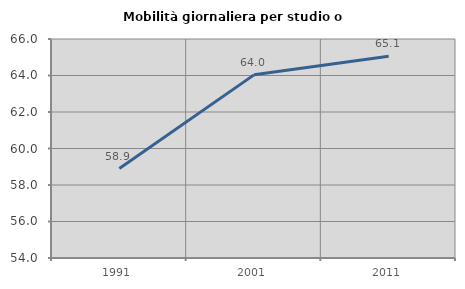
| Category | Mobilità giornaliera per studio o lavoro |
|---|---|
| 1991.0 | 58.902 |
| 2001.0 | 64.035 |
| 2011.0 | 65.056 |